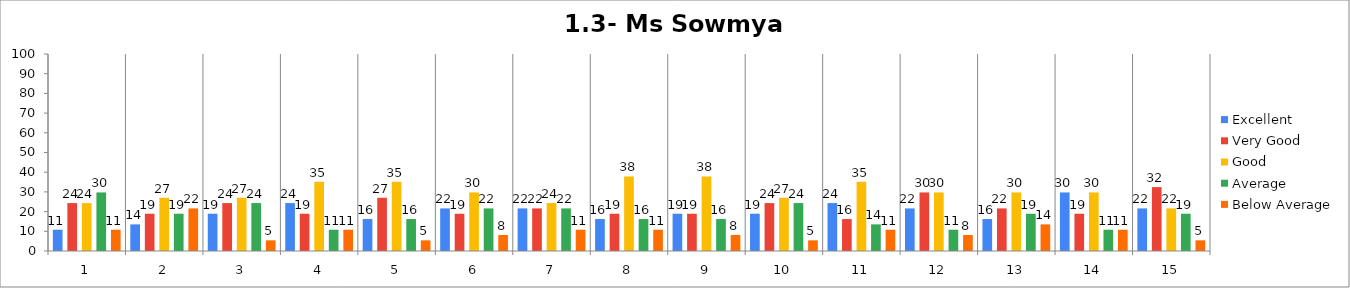
| Category | Excellent | Very Good | Good | Average | Below Average |
|---|---|---|---|---|---|
| 0 | 10.811 | 24.324 | 24.324 | 29.73 | 10.811 |
| 1 | 13.514 | 18.919 | 27.027 | 18.919 | 21.622 |
| 2 | 18.919 | 24.324 | 27.027 | 24.324 | 5.405 |
| 3 | 24.324 | 18.919 | 35.135 | 10.811 | 10.811 |
| 4 | 16.216 | 27.027 | 35.135 | 16.216 | 5.405 |
| 5 | 21.622 | 18.919 | 29.73 | 21.622 | 8.108 |
| 6 | 21.622 | 21.622 | 24.324 | 21.622 | 10.811 |
| 7 | 16.216 | 18.919 | 37.838 | 16.216 | 10.811 |
| 8 | 18.919 | 18.919 | 37.838 | 16.216 | 8.108 |
| 9 | 18.919 | 24.324 | 27.027 | 24.324 | 5.405 |
| 10 | 24.324 | 16.216 | 35.135 | 13.514 | 10.811 |
| 11 | 21.622 | 29.73 | 29.73 | 10.811 | 8.108 |
| 12 | 16.216 | 21.622 | 29.73 | 18.919 | 13.514 |
| 13 | 29.73 | 18.919 | 29.73 | 10.811 | 10.811 |
| 14 | 21.622 | 32.432 | 21.622 | 18.919 | 5.405 |